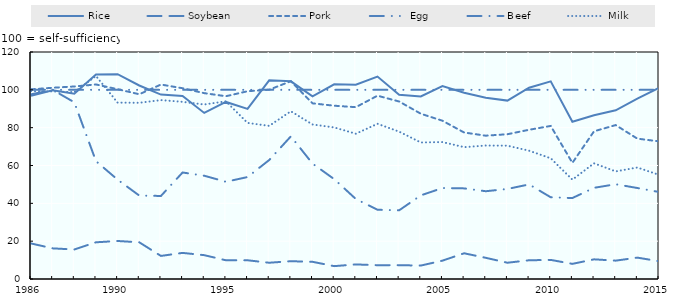
| Category | Rice | Soybean | Pork | Egg | Beef | Milk  | Series 5 |
|---|---|---|---|---|---|---|---|
| 1986.0 | 96.9 | 18.8 | 100.253 | 100 | 97.6 | 99.312 |  |
| nan | 99.8 | 16.2 | 101.092 | 100 | 100 | 99.158 |  |
| nan | 97.9 | 15.6 | 101.776 | 100 | 93.4 | 98.789 |  |
| nan | 108.1 | 19.4 | 102.834 | 100 | 62.3 | 107.308 |  |
| 1990.0 | 108.3 | 20.1 | 100.337 | 100 | 52.5 | 93.241 |  |
| nan | 102.3 | 19.4 | 97.661 | 100 | 44.1 | 93.151 |  |
| nan | 97.5 | 12.2 | 102.795 | 100 | 43.9 | 94.583 |  |
| nan | 96.8 | 13.8 | 100.85 | 100 | 56.3 | 93.649 |  |
| nan | 87.8 | 12.6 | 98.25 | 100 | 54.6 | 92.252 |  |
| 1995.0 | 93.6 | 9.9 | 96.619 | 100 | 51.4 | 93.937 |  |
| nan | 89.9 | 9.9 | 99.266 | 100 | 53.9 | 82.515 |  |
| nan | 105 | 8.6 | 100.067 | 100 | 62.9 | 80.947 |  |
| nan | 104.5 | 9.4 | 104.557 | 100 | 75.4 | 88.67 |  |
| nan | 96.6 | 9.1 | 92.852 | 100 | 61 | 81.689 |  |
| 2000.0 | 102.9 | 6.8 | 91.606 | 100 | 52.8 | 80.121 |  |
| nan | 102.7 | 7.7 | 90.833 | 100 | 42.3 | 76.789 |  |
| nan | 107 | 7.3 | 96.901 | 100 | 36.6 | 82.05 |  |
| nan | 97.4 | 7.3 | 93.827 | 100 | 36.3 | 77.906 |  |
| nan | 96.5 | 7.1 | 87.379 | 100 | 44.2 | 72.183 |  |
| 2005.0 | 102 | 9.7 | 83.666 | 100 | 48.1 | 72.394 |  |
| nan | 98.5 | 13.6 | 77.448 | 100 | 47.9 | 69.699 |  |
| nan | 95.8 | 11.2 | 75.76 | 100 | 46.4 | 70.558 |  |
| nan | 94.3 | 8.6 | 76.534 | 100 | 47.6 | 70.478 |  |
| nan | 101.1 | 9.9 | 78.883 | 100 | 50 | 67.824 |  |
| 2010.0 | 104.5 | 10.1 | 80.916 | 100 | 43.2 | 63.804 |  |
| nan | 83.1 | 8 | 61.385 | 100 | 42.8 | 52.531 |  |
| nan | 86.6 | 10.4 | 78.089 | 100 | 48.2 | 61.153 |  |
| nan | 89.2 | 9.7 | 81.37 | 100 | 50.1 | 56.89 |  |
| nan | 95.4 | 11.3 | 74.203 | 100 | 48.1 | 58.93 |  |
| 2015.0 | 101 | 9.4 | 72.757 | 100 | 46 | 55.081 |  |